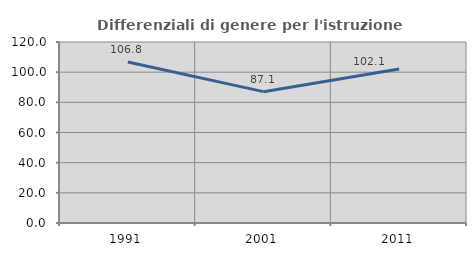
| Category | Differenziali di genere per l'istruzione superiore |
|---|---|
| 1991.0 | 106.775 |
| 2001.0 | 87.083 |
| 2011.0 | 102.11 |